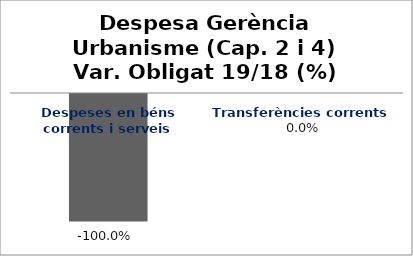
| Category | Series 0 |
|---|---|
| Despeses en béns corrents i serveis | -1 |
| Transferències corrents | 0 |